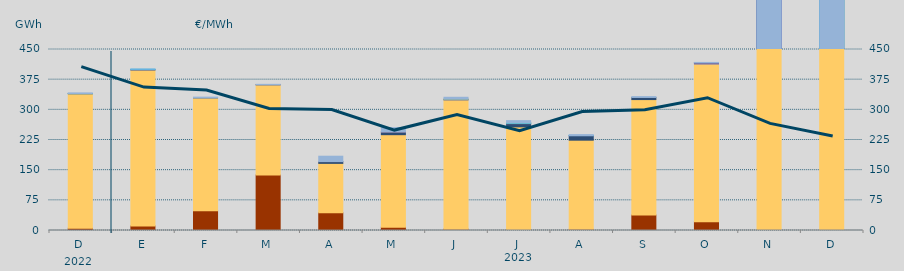
| Category | Carbón | Ciclo Combinado | Cogeneración | Consumo Bombeo | Enlace Península Baleares | Eólica | Hidráulica | Internacionales | Otras Renovables | Residuos no Renovables | Solar fotovoltaica | Solar térmica | Turbinación bombeo |
|---|---|---|---|---|---|---|---|---|---|---|---|---|---|
| D | 5478 | 334554.358 | 0 | 258.25 | 0 | 0 | 227.925 | 0 | 0 | 0 | 0 | 0 | 1594.663 |
| E | 11268 | 387716.675 | 0 | 572.573 | 681.8 | 0 | 835.85 | 0 | 0 | 0 | 0 | 0 | 77.5 |
| F | 48958 | 280733.853 | 0 | 43.033 | 0 | 0 | 0 | 0 | 0 | 0 | 0 | 0 | 1846.75 |
| M | 138130.4 | 224071.017 | 0 | 316.875 | 152.4 | 0 | 0 | 0 | 0 | 0 | 0 | 0 | 717.667 |
| A | 43920 | 122955.6 | 0 | 4435.017 | 148.1 | 0 | 0 | 0 | 0 | 0 | 0 | 0 | 13251.877 |
| M | 8172.8 | 230037.608 | 0 | 6374.2 | 1318.3 | 0 | 0 | 0 | 0 | 0 | 0 | 0 | 9849.292 |
| J | 3400 | 321495.908 | 0 | 191.083 | 1224 | 175.975 | 0 | 0 | 0 | 0 | 0 | 0 | 4721.775 |
| J | 2260 | 255417.442 | 0 | 8045.584 | 1144 | 41.666 | 475 | 647.8 | 0 | 0 | 0 | 0 | 5129.95 |
| A | 2834 | 221717.226 | 0 | 11049.55 | 362 | 0 | 144.325 | 0 | 0 | 0 | 0 | 0 | 2296.991 |
| S | 38425 | 287082.594 | 0 | 5227.584 | 0 | 0 | 0 | 0 | 0 | 0 | 0 | 0 | 2105.767 |
| O | 22001.7 | 391922.459 | 600 | 1995.167 | 550.783 | 0 | 0 | 0 | 108.25 | 0 | 0 | 0 | 659.78 |
| N | 0 | 573207.834 | 491.7 | 12124.45 | 319.05 | 100 | 16.5 | 0 | 1115.767 | 0 | 0 | 0 | 1155.7 |
| D | 397.083 | 607349.126 | 0 | 2462.5 | 0 | 0 | 991 | 0 | 0 | 0 | 0 | 0 | 2414.918 |